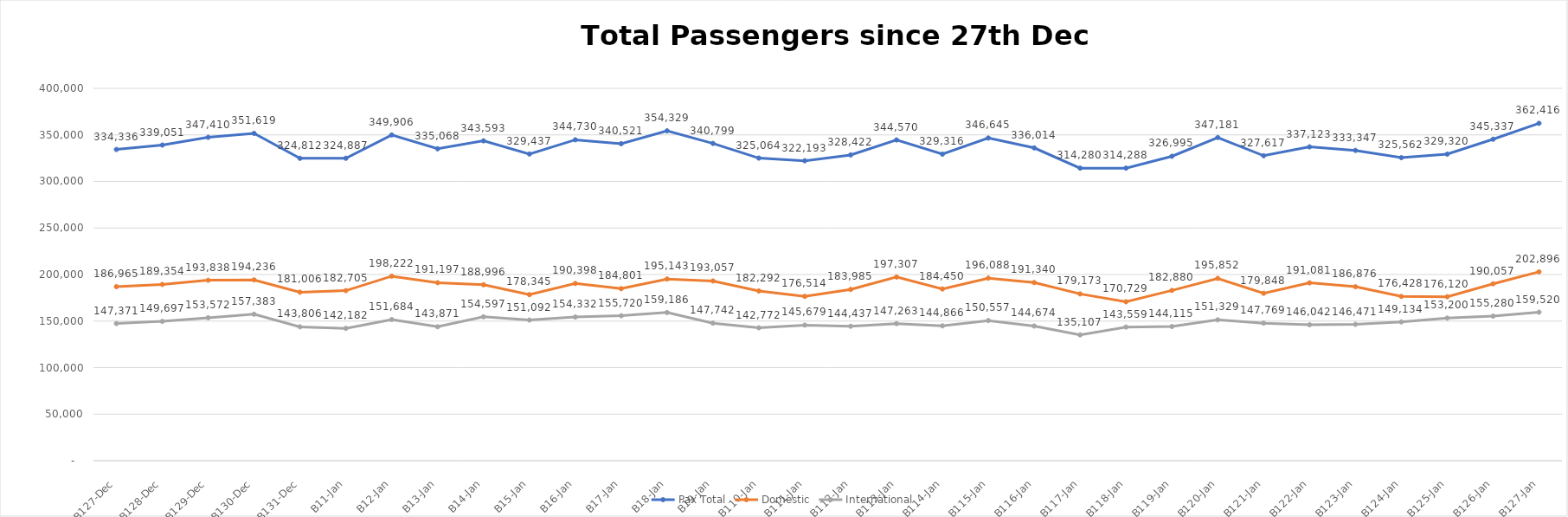
| Category | Pax Total |  Domestic  |  International  |
|---|---|---|---|
| 2022-12-27 | 334336 | 186965 | 147371 |
| 2022-12-28 | 339051 | 189354 | 149697 |
| 2022-12-29 | 347410 | 193838 | 153572 |
| 2022-12-30 | 351619 | 194236 | 157383 |
| 2022-12-31 | 324812 | 181006 | 143806 |
| 2023-01-01 | 324887 | 182705 | 142182 |
| 2023-01-02 | 349906 | 198222 | 151684 |
| 2023-01-03 | 335068 | 191197 | 143871 |
| 2023-01-04 | 343593 | 188996 | 154597 |
| 2023-01-05 | 329437 | 178345 | 151092 |
| 2023-01-06 | 344730 | 190398 | 154332 |
| 2023-01-07 | 340521 | 184801 | 155720 |
| 2023-01-08 | 354329 | 195143 | 159186 |
| 2023-01-09 | 340799 | 193057 | 147742 |
| 2023-01-10 | 325064 | 182292 | 142772 |
| 2023-01-11 | 322193 | 176514 | 145679 |
| 2023-01-12 | 328422 | 183985 | 144437 |
| 2023-01-13 | 344570 | 197307 | 147263 |
| 2023-01-14 | 329316 | 184450 | 144866 |
| 2023-01-15 | 346645 | 196088 | 150557 |
| 2023-01-16 | 336014 | 191340 | 144674 |
| 2023-01-17 | 314280 | 179173 | 135107 |
| 2023-01-18 | 314288 | 170729 | 143559 |
| 2023-01-19 | 326995 | 182880 | 144115 |
| 2023-01-20 | 347181 | 195852 | 151329 |
| 2023-01-21 | 327617 | 179848 | 147769 |
| 2023-01-22 | 337123 | 191081 | 146042 |
| 2023-01-23 | 333347 | 186876 | 146471 |
| 2023-01-24 | 325562 | 176428 | 149134 |
| 2023-01-25 | 329320 | 176120 | 153200 |
| 2023-01-26 | 345337 | 190057 | 155280 |
| 2023-01-27 | 362416 | 202896 | 159520 |